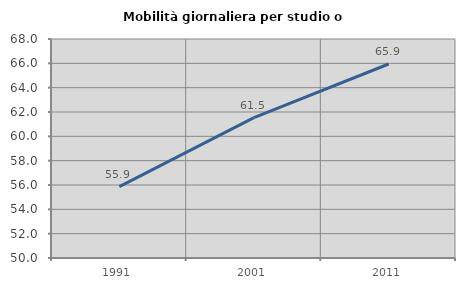
| Category | Mobilità giornaliera per studio o lavoro |
|---|---|
| 1991.0 | 55.872 |
| 2001.0 | 61.538 |
| 2011.0 | 65.944 |